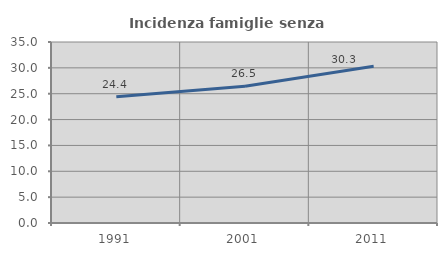
| Category | Incidenza famiglie senza nuclei |
|---|---|
| 1991.0 | 24.412 |
| 2001.0 | 26.451 |
| 2011.0 | 30.298 |